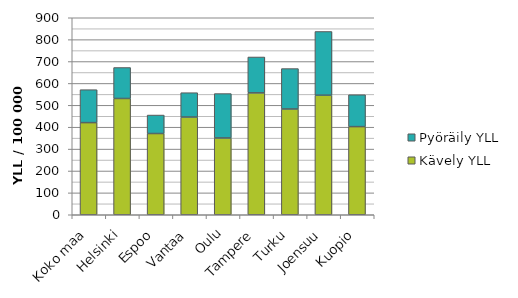
| Category | Kävely YLL | Pyöräily YLL |
|---|---|---|
| Koko maa | 420.933 | 150.483 |
| Helsinki | 531.18 | 141.507 |
| Espoo | 371.078 | 84.424 |
| Vantaa | 446.37 | 111.244 |
| Oulu | 350.73 | 202.904 |
| Tampere | 556.786 | 163.904 |
| Turku | 483.113 | 184.706 |
| Joensuu | 546.106 | 291.154 |
| Kuopio | 402.647 | 145.605 |